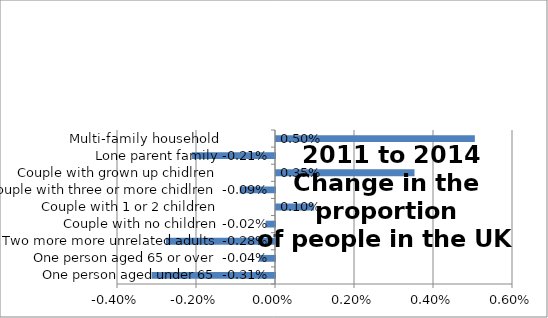
| Category | Series 0 |
|---|---|
| One person aged under 65 | -0.003 |
| One person aged 65 or over | 0 |
| Two more more unrelated adults | -0.003 |
| Couple with no children | 0 |
| Couple with 1 or 2 children | 0.001 |
| Couple with three or more chidlren | -0.001 |
| Couple with grown up chidlren | 0.004 |
| Lone parent family | -0.002 |
| Multi-family household | 0.005 |